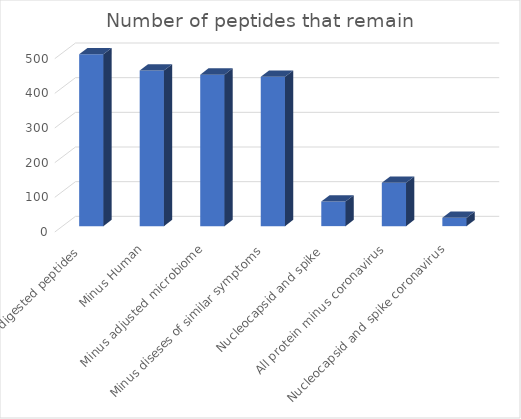
| Category | Number of peptides that remain |
|---|---|
| All theoretical digested peptides  | 496 |
| Minus Human | 449 |
| Minus adjusted microbiome | 437 |
| Minus diseses of similar symptoms | 431 |
| Nucleocapsid and spike  | 71 |
| All protein minus coronavirus | 125 |
| Nucleocapsid and spike coronavirus | 24 |